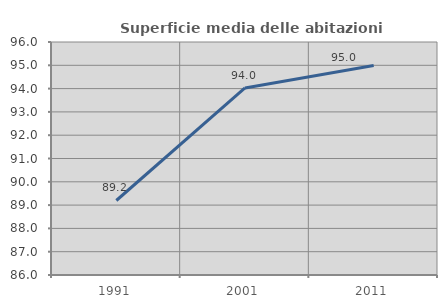
| Category | Superficie media delle abitazioni occupate |
|---|---|
| 1991.0 | 89.197 |
| 2001.0 | 94.027 |
| 2011.0 | 94.992 |